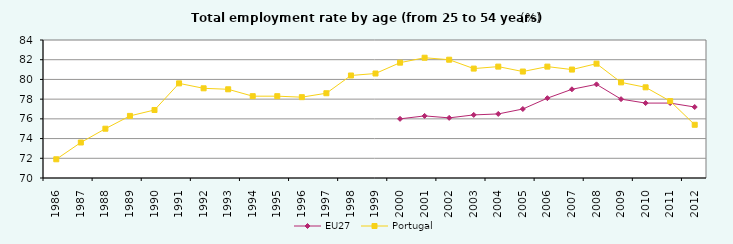
| Category | EU27 | Portugal |
|---|---|---|
| 1986 | 0 | 71.9 |
| 1987 | 0 | 73.6 |
| 1988 | 0 | 75 |
| 1989 | 0 | 76.3 |
| 1990 | 0 | 76.9 |
| 1991 | 0 | 79.6 |
| 1992 | 0 | 79.1 |
| 1993 | 0 | 79 |
| 1994 | 0 | 78.3 |
| 1995 | 0 | 78.3 |
| 1996 | 0 | 78.2 |
| 1997 | 0 | 78.6 |
| 1998 | 0 | 80.4 |
| 1999 | 0 | 80.6 |
| 2000 | 76 | 81.7 |
| 2001 | 76.3 | 82.2 |
| 2002 | 76.1 | 82 |
| 2003 | 76.4 | 81.1 |
| 2004 | 76.5 | 81.3 |
| 2005 | 77 | 80.8 |
| 2006 | 78.1 | 81.3 |
| 2007 | 79 | 81 |
| 2008 | 79.5 | 81.6 |
| 2009 | 78 | 79.7 |
| 2010 | 77.6 | 79.2 |
| 2011 | 77.6 | 77.8 |
| 2012 | 77.2 | 75.4 |